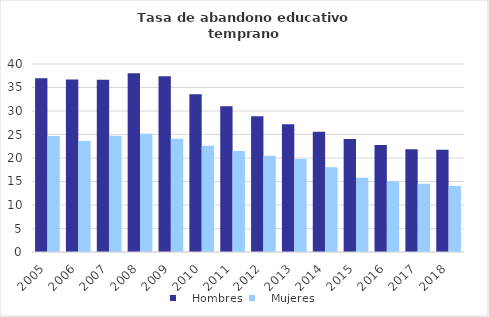
| Category |    Hombres |    Mujeres |
|---|---|---|
| 2005.0 | 36.959 | 24.7 |
| 2006.0 | 36.708 | 23.607 |
| 2007.0 | 36.631 | 24.737 |
| 2008.0 | 38.05 | 25.147 |
| 2009.0 | 37.398 | 24.114 |
| 2010.0 | 33.554 | 22.632 |
| 2011.0 | 31.035 | 21.468 |
| 2012.0 | 28.876 | 20.455 |
| 2013.0 | 27.176 | 19.791 |
| 2014.0 | 25.598 | 18.057 |
| 2015.0 | 24.035 | 15.788 |
| 2016.0 | 22.743 | 15.051 |
| 2017.0 | 21.846 | 14.537 |
| 2018.0 | 21.743 | 14.017 |